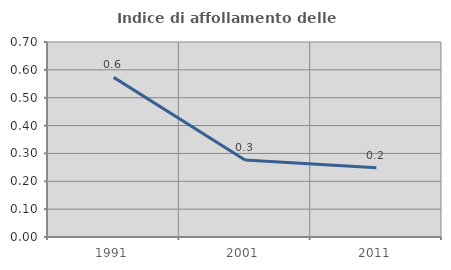
| Category | Indice di affollamento delle abitazioni  |
|---|---|
| 1991.0 | 0.573 |
| 2001.0 | 0.276 |
| 2011.0 | 0.249 |